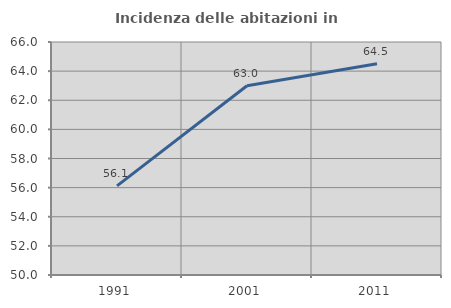
| Category | Incidenza delle abitazioni in proprietà  |
|---|---|
| 1991.0 | 56.122 |
| 2001.0 | 62.996 |
| 2011.0 | 64.5 |